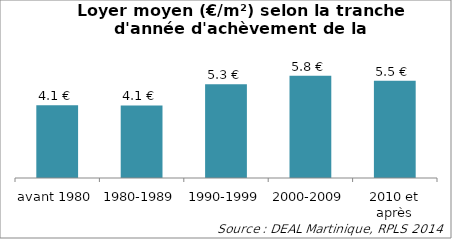
| Category | Series 0 |
|---|---|
| avant 1980 | 4.141 |
| 1980-1989 | 4.128 |
| 1990-1999 | 5.332 |
| 2000-2009 | 5.818 |
| 2010 et après | 5.534 |